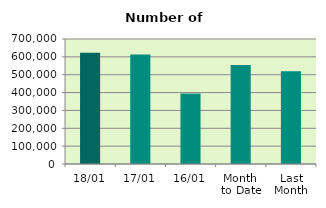
| Category | Series 0 |
|---|---|
| 18/01 | 622572 |
| 17/01 | 612736 |
| 16/01 | 395274 |
| Month 
to Date | 554358.462 |
| Last
Month | 519611.714 |